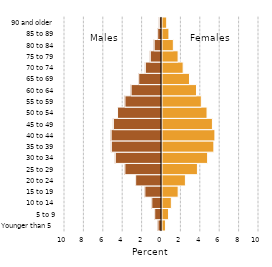
| Category | Series 0 |
|---|---|
| Younger than 5 | 0.357 |
| 5 to 9 | 0.675 |
| 10 to 14 | 0.963 |
| 15 to 19 | 1.667 |
| 20 to 24 | 2.413 |
| 25 to 29 | 3.654 |
| 30 to 34 | 4.703 |
| 35 to 39 | 5.347 |
| 40 to 44 | 5.454 |
| 45 to 49 | 5.198 |
| 50 to 54 | 4.644 |
| 55 to 59 | 4.055 |
| 60 to 64 | 3.558 |
| 65 to 69 | 2.835 |
| 70 to 74 | 2.181 |
| 75 to 79 | 1.659 |
| 80 to 84 | 1.17 |
| 85 to 89 | 0.714 |
| 90 and older | 0.485 |